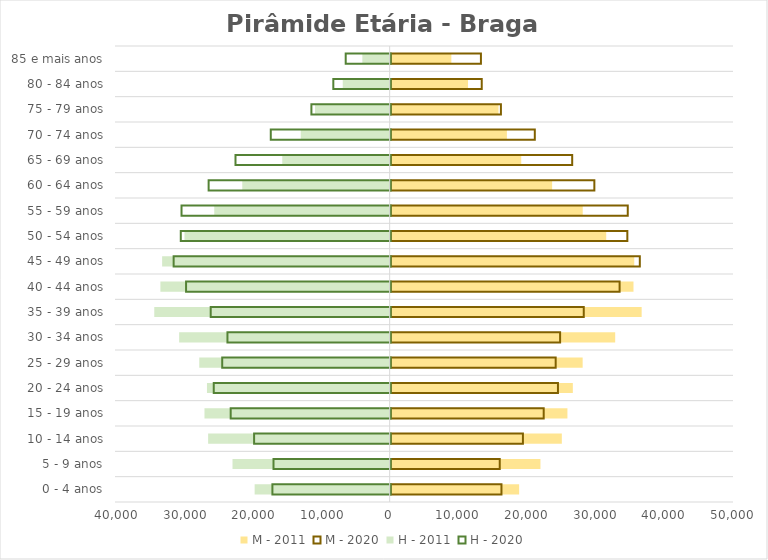
| Category | M - 2011 | M - 2020 | H - 2011 | H - 2020 |
|---|---|---|---|---|
| 0 - 4 anos | 18711 | 16135 | -19662 | -17222 |
| 5 - 9 anos | 21811 | 15885 | -22885 | -17063 |
| 10 - 14 anos | 24928 | 19260 | -26436 | -19888 |
| 15 - 19 anos | 25742 | 22286 | -26968 | -23298 |
| 20 - 24 anos | 26529 | 24362 | -26605 | -25765 |
| 25 - 29 anos | 27960 | 24031 | -27728 | -24532 |
| 30 - 34 anos | 32698 | 24675 | -30657 | -23770 |
| 35 - 39 anos | 36553 | 28120 | -34280 | -26208 |
| 40 - 44 anos | 35362 | 33340 | -33386 | -29796 |
| 45 - 49 anos | 35474 | 36284 | -33136 | -31606 |
| 50 - 54 anos | 31392 | 34467 | -29885 | -30566 |
| 55 - 59 anos | 27972 | 34528 | -25548 | -30458 |
| 60 - 64 anos | 23514 | 29663 | -21466 | -26510 |
| 65 - 69 anos | 19016 | 26436 | -15641 | -22598 |
| 70 - 74 anos | 16928 | 20991 | -12950 | -17460 |
| 75 - 79 anos | 15705 | 16055 | -10869 | -11544 |
| 80 - 84 anos | 11265 | 13262 | -6832 | -8352 |
| 85 e mais anos | 8839 | 13144 | -3978 | -6548 |